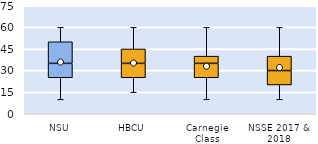
| Category | 25th | 50th | 75th |
|---|---|---|---|
| NSU | 25 | 10 | 15 |
| HBCU | 25 | 10 | 10 |
| Carnegie Class | 25 | 10 | 5 |
| NSSE 2017 & 2018 | 20 | 10 | 10 |